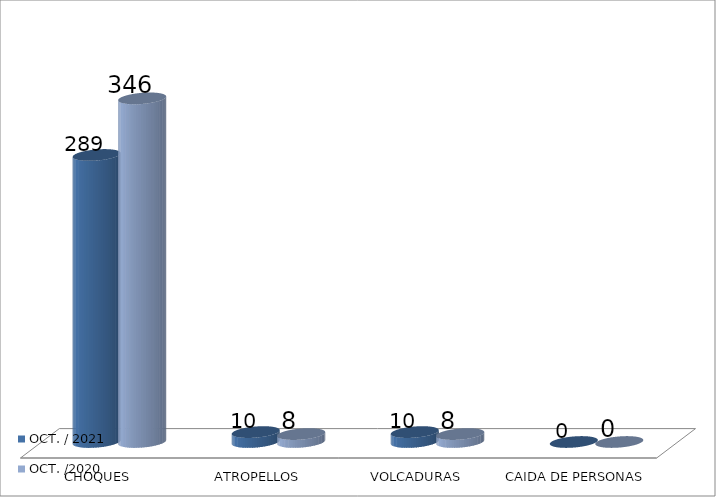
| Category | OCT. / 2021 | OCT. /2020 |
|---|---|---|
| CHOQUES | 289 | 346 |
| ATROPELLOS | 10 | 8 |
| VOLCADURAS | 10 | 8 |
| CAIDA DE PERSONAS | 0 | 0 |